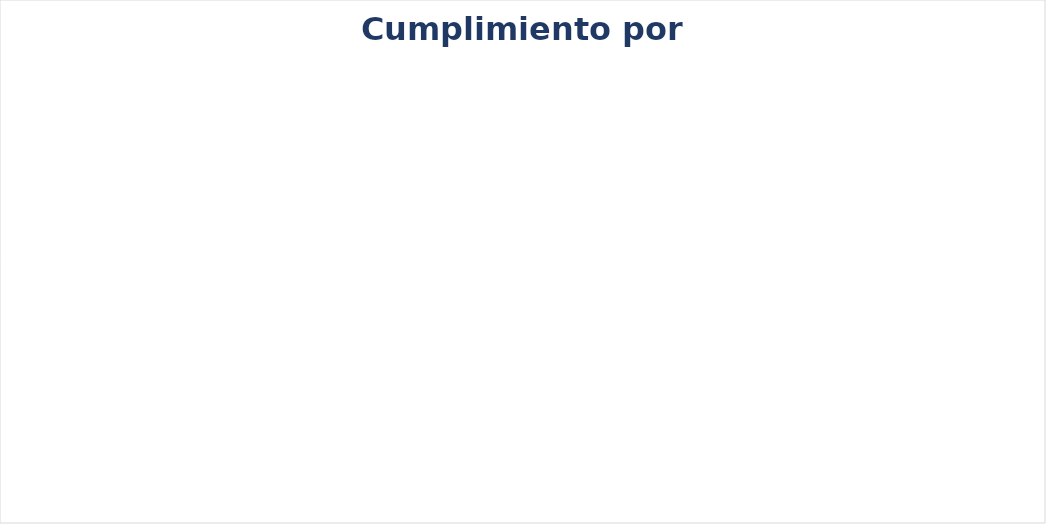
| Category | Series 0 |
|---|---|
| Mecanismos de contacto con el sujeto obligado | 1 |
| Información de interés   | 0.7 |
| Estructura orgánica y talento humano | 0.95 |
| Normatividad | 1 |
| Presupuesto | 1 |
| Planeación | 0.7 |
| Control | 0.9 |
| Contratación | 0.88 |
| Trámites y servicios | 1 |
| Instrumentos de gestión de información pública | 0.5 |